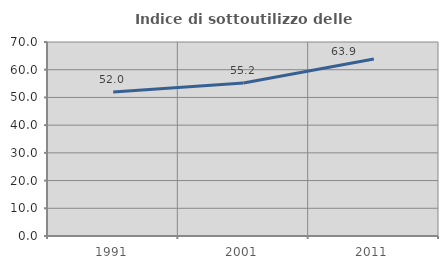
| Category | Indice di sottoutilizzo delle abitazioni  |
|---|---|
| 1991.0 | 51.974 |
| 2001.0 | 55.195 |
| 2011.0 | 63.889 |